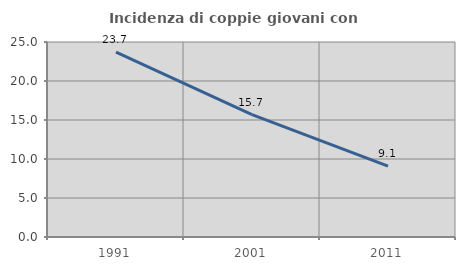
| Category | Incidenza di coppie giovani con figli |
|---|---|
| 1991.0 | 23.709 |
| 2001.0 | 15.695 |
| 2011.0 | 9.083 |